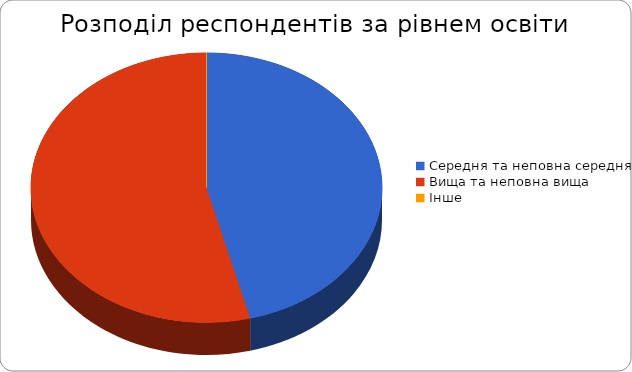
| Category | Series 0 |
|---|---|
| Середня та неповна середня | 23 |
| Вища та неповна вища | 27 |
| Інше | 0 |